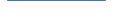
| Category | Series 0 |
|---|---|
| 0 | 60 |
| 1 | 49 |
| 2 | 61 |
| 3 | 45 |
| 4 | 58 |
| 5 | 88 |
| 6 | 66 |
| 7 | 52 |
| 8 | 43 |